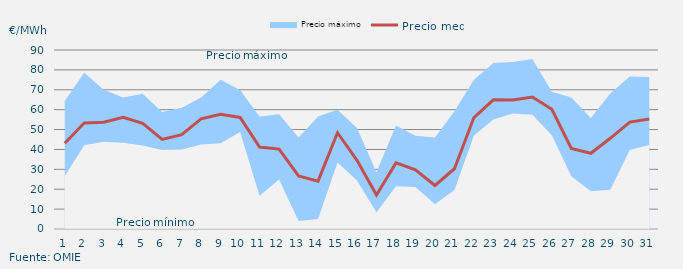
| Category | Precio medio |
|---|---|
| 1 | 43.101 |
| 2 | 53.297 |
| 3 | 53.683 |
| 4 | 56.185 |
| 5 | 53.104 |
| 6 | 45.056 |
| 7 | 47.445 |
| 8 | 55.404 |
| 9 | 57.682 |
| 10 | 56.1 |
| 11 | 41.174 |
| 12 | 40.198 |
| 13 | 26.671 |
| 14 | 24.051 |
| 15 | 48.392 |
| 16 | 34.55 |
| 17 | 17.066 |
| 18 | 33.259 |
| 19 | 29.713 |
| 20 | 21.873 |
| 21 | 30.291 |
| 22 | 56.026 |
| 23 | 64.939 |
| 24 | 64.904 |
| 25 | 66.385 |
| 26 | 60.176 |
| 27 | 40.483 |
| 28 | 38.08 |
| 29 | 45.609 |
| 30 | 53.758 |
| 31 | 55.321 |